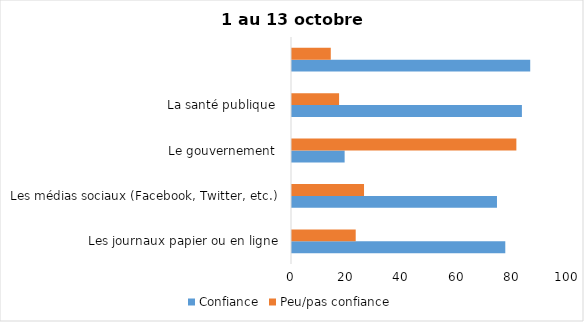
| Category | Confiance | Peu/pas confiance |
|---|---|---|
| Les journaux papier ou en ligne | 77 | 23 |
| Les médias sociaux (Facebook, Twitter, etc.) | 74 | 26 |
| Le gouvernement  | 19 | 81 |
| La santé publique  | 83 | 17 |